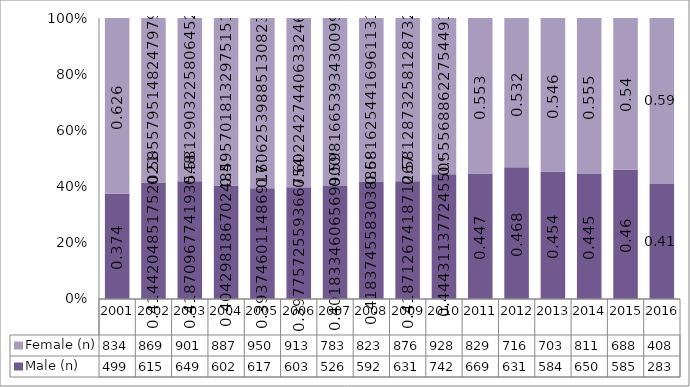
| Category | Male (n) | Female (n) |
|---|---|---|
| 2001.0 | 499 | 834 |
| 2002.0 | 615 | 869 |
| 2003.0 | 649 | 901 |
| 2004.0 | 602 | 887 |
| 2005.0 | 617 | 950 |
| 2006.0 | 603 | 913 |
| 2007.0 | 526 | 783 |
| 2008.0 | 592 | 823 |
| 2009.0 | 631 | 876 |
| 2010.0 | 742 | 928 |
| 2011.0 | 669 | 829 |
| 2012.0 | 631 | 716 |
| 2013.0 | 584 | 703 |
| 2014.0 | 650 | 811 |
| 2015.0 | 585 | 688 |
| 2016.0 | 283 | 408 |